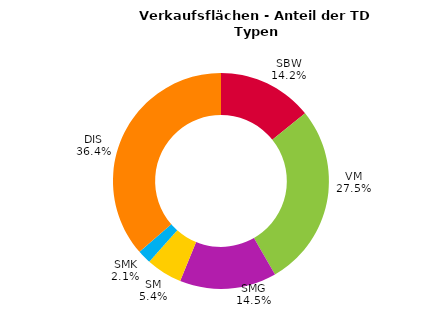
| Category | Series 0 |
|---|---|
| SBW | 0.142 |
| VM | 0.275 |
| SMG | 0.145 |
| SM | 0.054 |
| SMK | 0.021 |
| DIS | 0.364 |